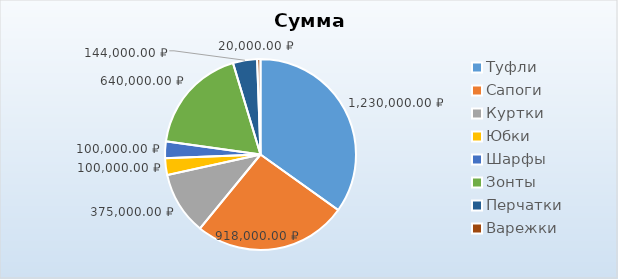
| Category | Series 0 |
|---|---|
| Туфли | 1230000 |
| Сапоги | 918000 |
| Куртки | 375000 |
| Юбки | 100000 |
| Шарфы | 100000 |
| Зонты | 640000 |
| Перчатки | 144000 |
| Варежки | 20000 |